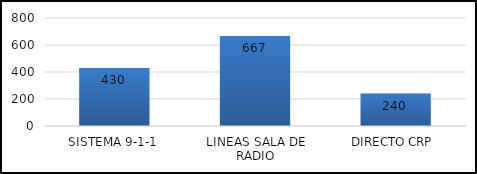
| Category | TOTAL |
|---|---|
| SISTEMA 9-1-1 | 430 |
| LINEAS SALA DE RADIO | 667 |
| DIRECTO CRP  | 240 |